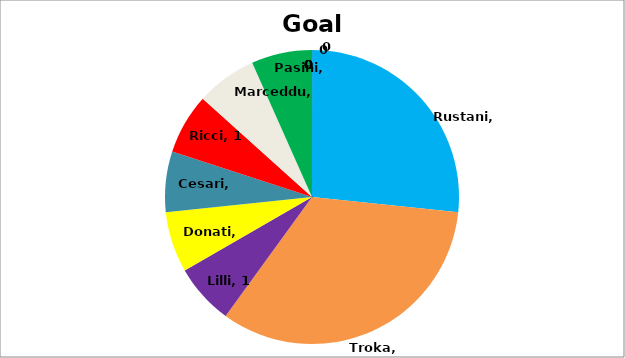
| Category | Series 0 |
|---|---|
| Rustani | 4 |
| Troka | 5 |
| Lilli | 1 |
| Donati | 1 |
| Cesari | 1 |
| Ricci | 1 |
| Marceddu | 1 |
| Pasini | 1 |